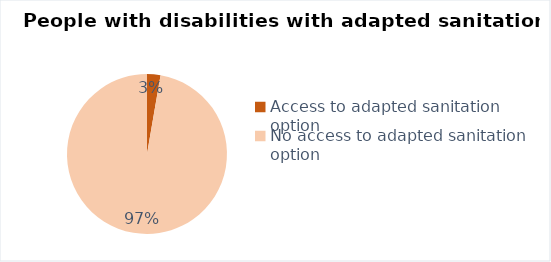
| Category | Series 0 |
|---|---|
| Access to adapted sanitation option | 396 |
| No access to adapted sanitation option | 14184 |